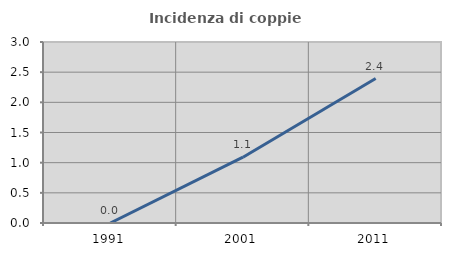
| Category | Incidenza di coppie miste |
|---|---|
| 1991.0 | 0 |
| 2001.0 | 1.091 |
| 2011.0 | 2.394 |